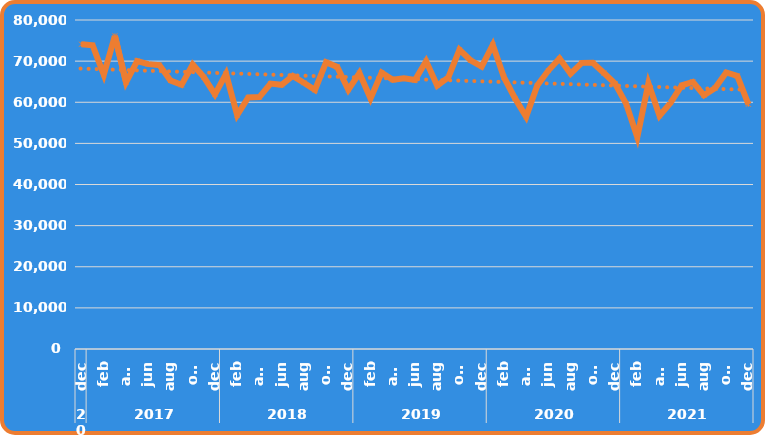
| Category | Totaal |
|---|---|
| 0 | 74113 |
| 1 | 73839 |
| 2 | 66691 |
| 3 | 76148 |
| 4 | 64852 |
| 5 | 70027 |
| 6 | 69264 |
| 7 | 69037 |
| 8 | 65288 |
| 9 | 64231 |
| 10 | 69184 |
| 11 | 66112 |
| 12 | 61930 |
| 13 | 66900 |
| 14 | 56854 |
| 15 | 61153 |
| 16 | 61261 |
| 17 | 64525 |
| 18 | 64238 |
| 19 | 66406 |
| 20 | 64730 |
| 21 | 62994 |
| 22 | 69749 |
| 23 | 68591 |
| 24 | 63029 |
| 25 | 67098 |
| 26 | 60918 |
| 27 | 67209 |
| 28 | 65456 |
| 29 | 65808 |
| 30 | 65403 |
| 31 | 69994 |
| 32 | 64039 |
| 33 | 66065 |
| 34 | 72780 |
| 35 | 70217 |
| 36 | 68661 |
| 37 | 73964 |
| 38 | 66085 |
| 39 | 60931 |
| 40 | 56462 |
| 41 | 64080 |
| 42 | 67704 |
| 43 | 70633 |
| 44 | 66956 |
| 45 | 69577 |
| 46 | 69616 |
| 47 | 67114 |
| 48 | 64531 |
| 49 | 59599 |
| 50 | 51512 |
| 51 | 64607 |
| 52 | 56697 |
| 53 | 59897 |
| 54 | 64122 |
| 55 | 64943 |
| 56 | 61690 |
| 57 | 63455 |
| 58 | 67245 |
| 59 | 66390 |
| 60 | 59498 |